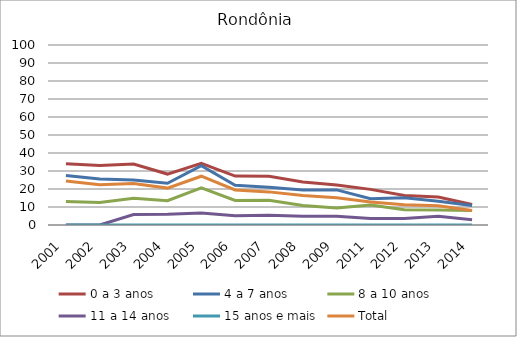
| Category | 0 a 3 anos | 4 a 7 anos | 8 a 10 anos | 11 a 14 anos | 15 anos e mais | Total |
|---|---|---|---|---|---|---|
| 2001.0 | 34 | 27.5 | 13 | 0 | 0 | 24.5 |
| 2002.0 | 33 | 25.5 | 12.5 | 0 | 0 | 22.3 |
| 2003.0 | 33.9 | 25 | 14.8 | 5.8 | 0 | 23.1 |
| 2004.0 | 28.3 | 23.2 | 13.5 | 6 | 0 | 20.5 |
| 2005.0 | 34.3 | 32.9 | 20.7 | 6.7 | 0 | 27.1 |
| 2006.0 | 27.2 | 22.1 | 13.6 | 5.2 | 0 | 19.5 |
| 2007.0 | 27.1 | 21 | 13.7 | 5.4 | 0 | 18.4 |
| 2008.0 | 23.9 | 19.4 | 10.8 | 4.8 | 0 | 16.4 |
| 2009.0 | 22.2 | 19.5 | 9.4 | 4.8 | 0 | 15.1 |
| 2011.0 | 19.8 | 14.6 | 11.1 | 3.6 | 0 | 12.8 |
| 2012.0 | 16.4 | 15.1 | 8.5 | 3.6 | 0 | 11.2 |
| 2013.0 | 15.6 | 13.2 | 8.4 | 4.8 | 0 | 10.7 |
| 2014.0 | 11.4 | 10.8 | 8.1 | 2.9 | 0 | 8 |